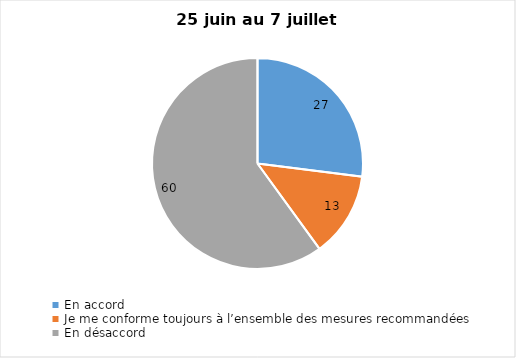
| Category | Series 0 |
|---|---|
| En accord | 27 |
| Je me conforme toujours à l’ensemble des mesures recommandées | 13 |
| En désaccord | 60 |